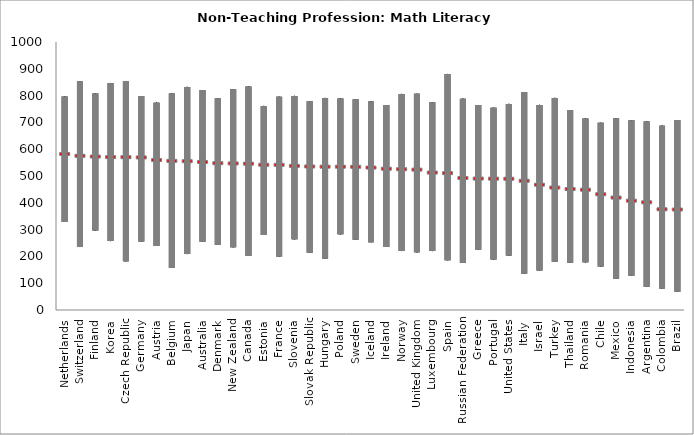
| Category | min | mean | max |
|---|---|---|---|
| Netherlands | 328.346 | 583.973 | 796.565 |
| Switzerland | 234.951 | 577.283 | 853.848 |
| Finland | 296.752 | 574.496 | 807.782 |
| Korea | 257.151 | 572.223 | 847.102 |
| Czech Republic | 181.718 | 572.114 | 854.487 |
| Germany | 256.029 | 571.169 | 798.201 |
| Austria | 238.799 | 561.441 | 773.648 |
| Belgium | 157.104 | 558.347 | 808 |
| Japan | 208.685 | 557.036 | 832.536 |
| Australia | 254.985 | 554.336 | 820.79 |
| Denmark | 242.787 | 549.63 | 790.084 |
| New Zealand | 234.156 | 548.672 | 823.407 |
| Canada | 201.862 | 547.889 | 833.798 |
| Estonia | 279.958 | 543.767 | 761.497 |
| France | 199.65 | 543.585 | 795.506 |
| Slovenia | 263.678 | 539.643 | 798.948 |
| Slovak Republic | 213.733 | 537.269 | 778.649 |
| Hungary | 191.611 | 536.649 | 791.315 |
| Poland | 282.591 | 536.594 | 789.632 |
| Sweden | 261.715 | 536.133 | 786.485 |
| Iceland | 253.256 | 533.316 | 778.182 |
| Ireland | 235.029 | 529.061 | 764.722 |
| Norway | 219.964 | 527.212 | 806.208 |
| United Kingdom | 215.182 | 525.702 | 806.551 |
| Luxembourg | 219.824 | 514.599 | 775.113 |
| Spain | 185.971 | 512.448 | 880.737 |
| Russian Federation | 175.347 | 494.481 | 788.277 |
| Greece | 224.872 | 492.332 | 764.566 |
| Portugal | 188.37 | 492.021 | 754.409 |
| United States | 203.42 | 491.615 | 769.115 |
| Italy | 134.858 | 483.991 | 813.437 |
| Israel | 147.757 | 469.417 | 765.345 |
| Turkey | 180.503 | 458.761 | 791.502 |
| Thailand | 176.375 | 453.036 | 746.214 |
| Romania | 177.792 | 450.73 | 714.636 |
| Chile | 162.198 | 433.796 | 698.372 |
| Mexico | 116.755 | 421.342 | 715.789 |
| Indonesia | 127.644 | 409.797 | 707.813 |
| Argentina | 86.61 | 403.786 | 703.186 |
| Colombia | 80.675 | 377.67 | 687.654 |
| Brazil | 68.445 | 376.76 | 708.934 |